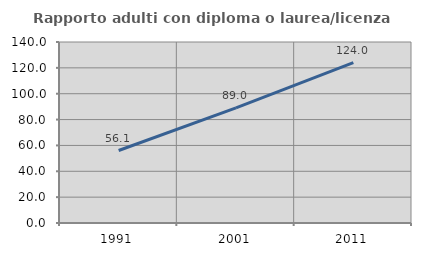
| Category | Rapporto adulti con diploma o laurea/licenza media  |
|---|---|
| 1991.0 | 56.056 |
| 2001.0 | 89.04 |
| 2011.0 | 124.047 |